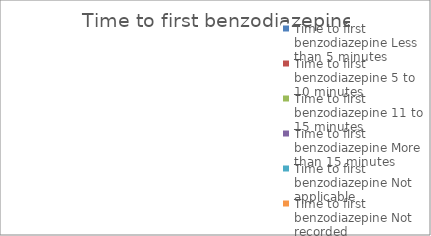
| Category | Series 1 | Series 0 |
|---|---|---|
| 0 | 0 | 0 |
| 1 | 0 | 0 |
| 2 | 0 | 0 |
| 3 | 0 | 0 |
| 4 | 0 | 0 |
| 5 | 0 | 0 |